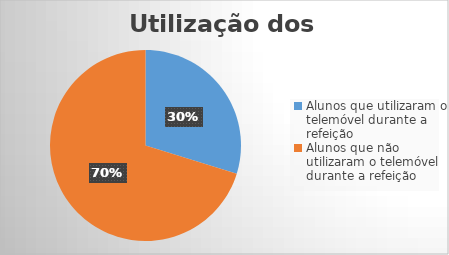
| Category | Series 5 |
|---|---|
| Alunos que utilizaram o telemóvel durante a refeição  | 25 |
| Alunos que não utilizaram o telemóvel durante a refeição  | 59 |